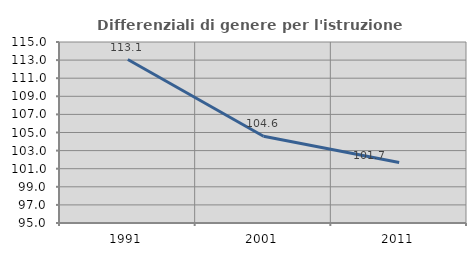
| Category | Differenziali di genere per l'istruzione superiore |
|---|---|
| 1991.0 | 113.059 |
| 2001.0 | 104.582 |
| 2011.0 | 101.693 |